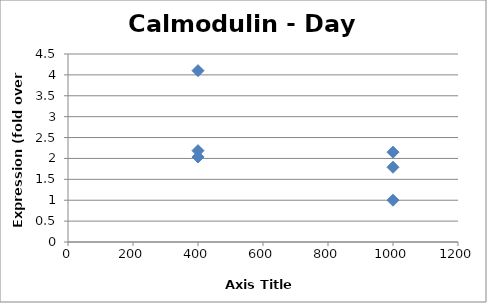
| Category | Series 0 |
|---|---|
| 1000.0 | 2.15 |
| 1000.0 | 1.789 |
| 1000.0 | 1 |
| 400.0 | 2.036 |
| 400.0 | 4.101 |
| 400.0 | 2.187 |